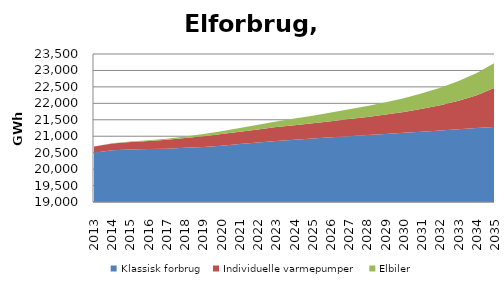
| Category | Klassisk forbrug | Individuelle varmepumper | Elbiler |
|---|---|---|---|
| 2013.0 | 20500.88 | 185.463 | 2.652 |
| 2014.0 | 20575.328 | 207.127 | 5.861 |
| 2015.0 | 20596.187 | 228.157 | 11.511 |
| 2016.0 | 20608.21 | 249.744 | 20.174 |
| 2017.0 | 20620.71 | 269.453 | 32.032 |
| 2018.0 | 20647.69 | 298.039 | 47.281 |
| 2019.0 | 20675.667 | 324.966 | 66.099 |
| 2020.0 | 20711.807 | 352.219 | 88.698 |
| 2021.0 | 20760.5 | 375.99 | 113.191 |
| 2022.0 | 20808.397 | 398.241 | 139.569 |
| 2023.0 | 20858.365 | 419.755 | 167.885 |
| 2024.0 | 20895.885 | 441.276 | 198.016 |
| 2025.0 | 20930.435 | 464.631 | 230.013 |
| 2026.0 | 20966.286 | 491.161 | 263.913 |
| 2027.0 | 21001.418 | 519.935 | 299.694 |
| 2028.0 | 21034.111 | 551.035 | 337.358 |
| 2029.0 | 21067.765 | 591.516 | 376.903 |
| 2030.0 | 21101.985 | 637.837 | 418.332 |
| 2031.0 | 21137.277 | 697.132 | 471.525 |
| 2032.0 | 21173.676 | 768.315 | 531.481 |
| 2033.0 | 21208.568 | 869.455 | 599.062 |
| 2034.0 | 21246.704 | 1000.15 | 675.236 |
| 2035.0 | 21286.034 | 1190.033 | 761.095 |